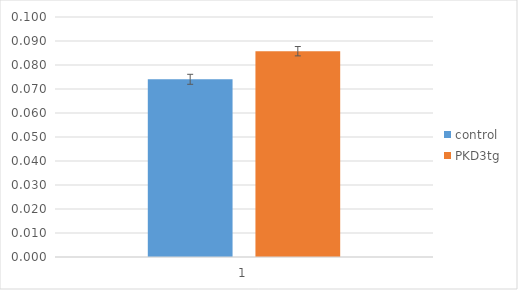
| Category | control | PKD3tg |
|---|---|---|
| 0 | 0.074 | 0.086 |